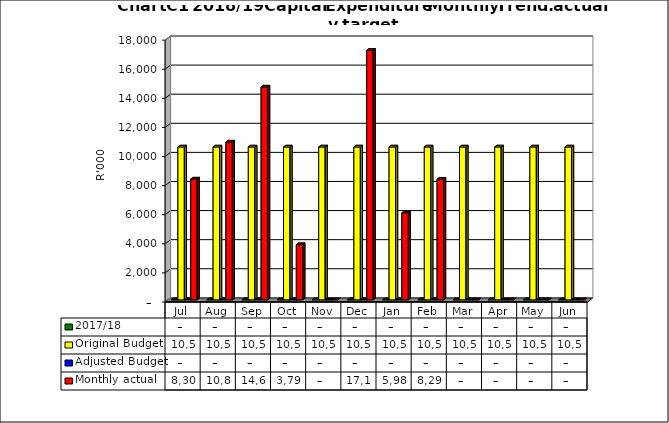
| Category | 2017/18 | Original Budget | Adjusted Budget | Monthly actual |
|---|---|---|---|---|
| Jul | 0 | 10507583 | 0 | 8304279 |
| Aug | 0 | 10507583 | 0 | 10846262 |
| Sep | 0 | 10507583 | 0 | 14627546 |
| Oct | 0 | 10507583 | 0 | 3793648 |
| Nov | 0 | 10507583 | 0 | 0 |
| Dec | 0 | 10507583 | 0 | 17149537 |
| Jan | 0 | 10507583 | 0 | 5984148 |
| Feb | 0 | 10507583 | 0 | 8293676 |
| Mar | 0 | 10507583 | 0 | 0 |
| Apr | 0 | 10507583 | 0 | 0 |
| May | 0 | 10507583 | 0 | 0 |
| Jun | 0 | 10507583 | 0 | 0 |